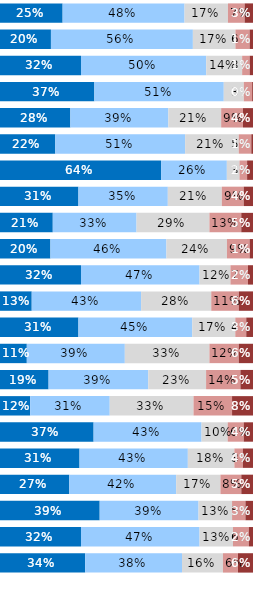
| Category | Almost Always or Always | Usually | Occasionally | Seldom | Never or Almost Never |
|---|---|---|---|---|---|
| Q1 | 0.248 | 0.482 | 0.172 | 0.066 | 0.033 |
| Q2 | 0.201 | 0.561 | 0.168 | 0.056 | 0.013 |
| Q3 | 0.32 | 0.495 | 0.142 | 0.03 | 0.013 |
| Q4 | 0.373 | 0.512 | 0.079 | 0.033 | 0.003 |
| Q5 | 0.278 | 0.387 | 0.209 | 0.086 | 0.04 |
| Q6 | 0.219 | 0.513 | 0.212 | 0.05 | 0.007 |
| Q7 | 0.637 | 0.26 | 0.05 | 0.03 | 0.023 |
| Q8 | 0.31 | 0.353 | 0.213 | 0.087 | 0.037 |
| Q9 | 0.209 | 0.331 | 0.288 | 0.126 | 0.046 |
| Q10 | 0.199 | 0.458 | 0.239 | 0.09 | 0.013 |
| Q11 | 0.32 | 0.469 | 0.122 | 0.069 | 0.02 |
| Q12 | 0.125 | 0.432 | 0.277 | 0.109 | 0.056 |
| Q13 | 0.31 | 0.45 | 0.17 | 0.043 | 0.027 |
| Q14 | 0.106 | 0.387 | 0.334 | 0.116 | 0.056 |
| Q15 | 0.192 | 0.394 | 0.228 | 0.136 | 0.05 |
| Q16 | 0.119 | 0.315 | 0.331 | 0.152 | 0.083 |
| Q17 | 0.37 | 0.427 | 0.103 | 0.063 | 0.037 |
| Q18 | 0.314 | 0.428 | 0.184 | 0.033 | 0.04 |
| Q19 | 0.274 | 0.422 | 0.175 | 0.083 | 0.046 |
| Q20 | 0.394 | 0.391 | 0.132 | 0.053 | 0.03 |
| Q21 | 0.32 | 0.469 | 0.132 | 0.063 | 0.017 |
| Q22 | 0.337 | 0.383 | 0.162 | 0.059 | 0.059 |